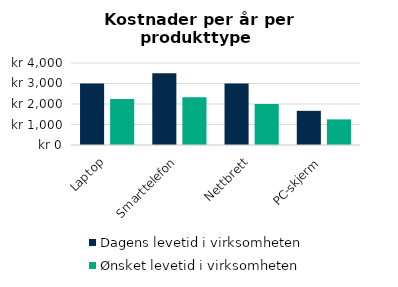
| Category | Dagens levetid i virksomheten | Ønsket levetid i virksomheten |
|---|---|---|
| Laptop | 3000 | 2250 |
| Smarttelefon | 3500 | 2333.333 |
| Nettbrett | 3000 | 2000 |
| PC-skjerm | 1666.667 | 1250 |